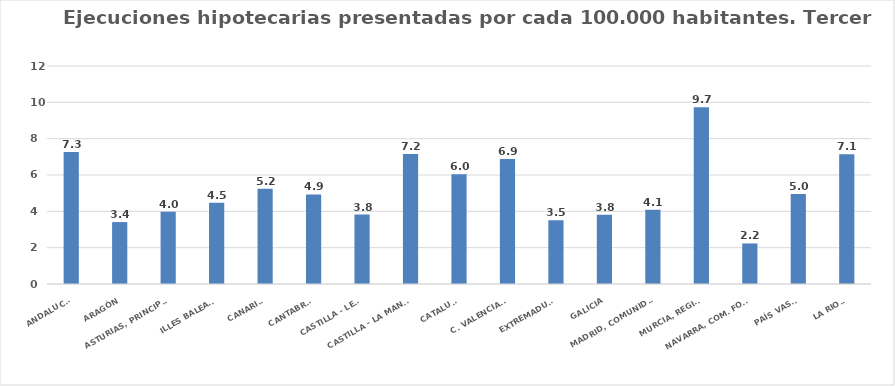
| Category | Series 0 |
|---|---|
| ANDALUCÍA | 7.273 |
| ARAGÓN | 3.409 |
| ASTURIAS, PRINCIPADO | 3.974 |
| ILLES BALEARS | 4.475 |
| CANARIAS | 5.242 |
| CANTABRIA | 4.928 |
| CASTILLA - LEÓN | 3.819 |
| CASTILLA - LA MANCHA | 7.161 |
| CATALUÑA | 6.039 |
| C. VALENCIANA | 6.88 |
| EXTREMADURA | 3.509 |
| GALICIA | 3.815 |
| MADRID, COMUNIDAD | 4.088 |
| MURCIA, REGIÓN | 9.725 |
| NAVARRA, COM. FORAL | 2.231 |
| PAÍS VASCO | 4.955 |
| LA RIOJA | 7.137 |